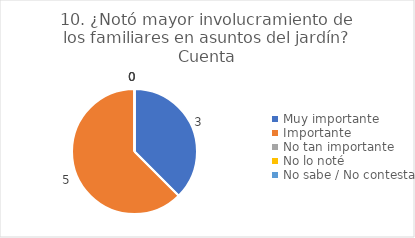
| Category | 10. ¿Notó mayor involucramiento de los familiares en asuntos del jardín? |
|---|---|
| Muy importante  | 0.375 |
| Importante  | 0.625 |
| No tan importante  | 0 |
| No lo noté  | 0 |
| No sabe / No contesta | 0 |